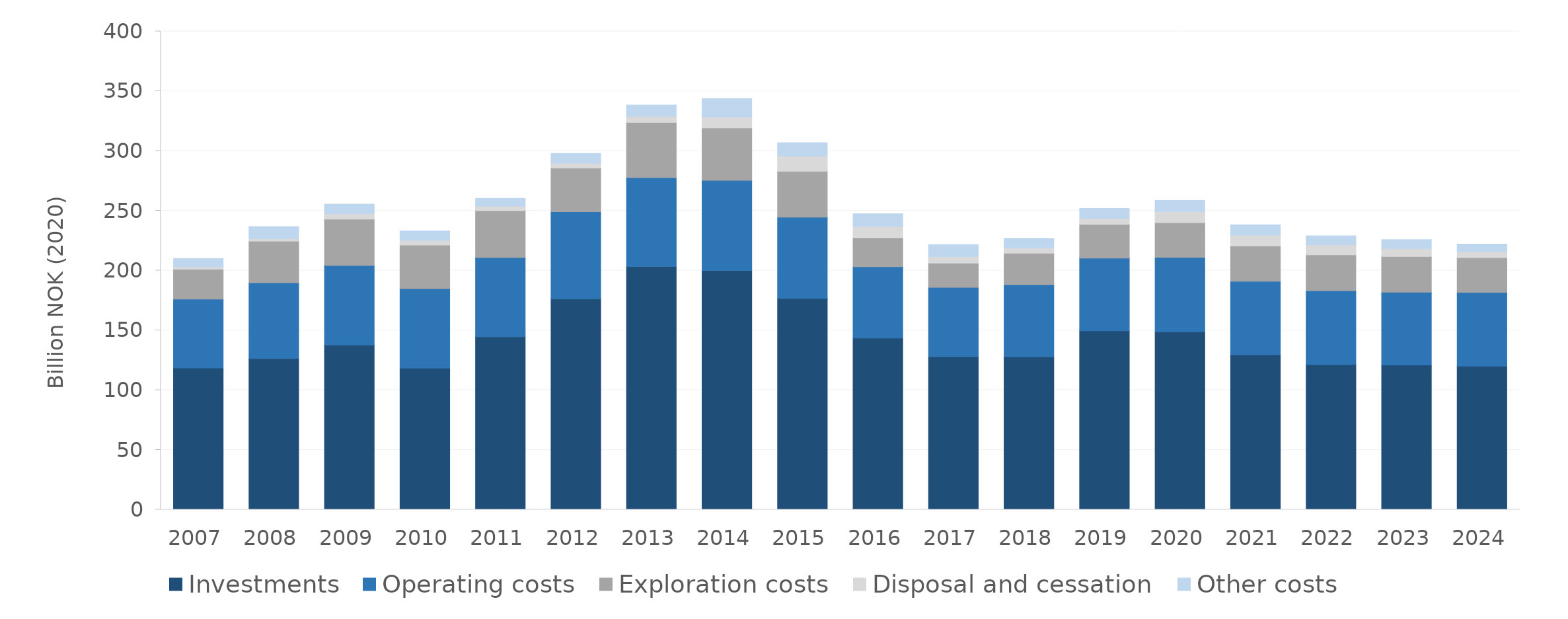
| Category | Investments | Operating costs | Exploration costs | Disposal and cessation | Other costs |
|---|---|---|---|---|---|
| 2007.0 | 118.456 | 57.643 | 24.999 | 2.072 | 6.904 |
| 2008.0 | 126.372 | 63.362 | 34.791 | 2.172 | 9.992 |
| 2009.0 | 137.763 | 66.542 | 38.671 | 4.545 | 7.951 |
| 2010.0 | 118.437 | 66.543 | 36.241 | 4 | 7.969 |
| 2011.0 | 144.645 | 66.254 | 39.23 | 3.685 | 6.587 |
| 2012.0 | 176.181 | 73.023 | 36.552 | 3.96 | 8.221 |
| 2013.0 | 203.38 | 74.444 | 46.005 | 5.014 | 9.593 |
| 2014.0 | 200.02 | 75.371 | 43.835 | 9.098 | 15.606 |
| 2015.0 | 176.69 | 67.971 | 38.342 | 12.674 | 11.29 |
| 2016.0 | 143.553 | 59.662 | 24.257 | 9.356 | 10.718 |
| 2017.0 | 127.988 | 57.868 | 20.415 | 5.272 | 10.076 |
| 2018.0 | 127.918 | 60.275 | 26.306 | 4.397 | 7.997 |
| 2019.0 | 149.542 | 60.825 | 28.336 | 4.788 | 8.492 |
| 2020.0 | 148.816 | 62.169 | 29.047 | 9.19 | 9.4 |
| 2021.0 | 129.578 | 61.403 | 29.639 | 8.899 | 8.761 |
| 2022.0 | 121.461 | 61.646 | 30.024 | 8.452 | 7.412 |
| 2023.0 | 120.937 | 60.991 | 29.805 | 6.699 | 7.432 |
| 2024.0 | 119.982 | 61.815 | 28.961 | 4.963 | 6.37 |